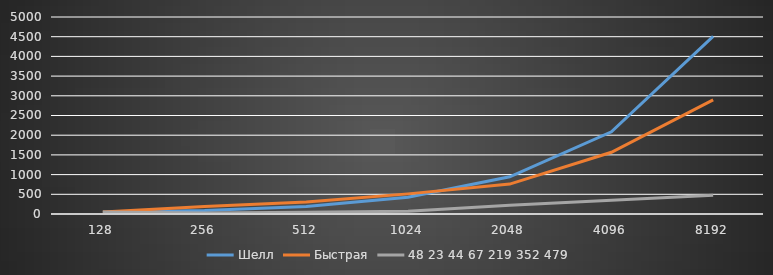
| Category | Шелл | Быстрая | 48 |
|---|---|---|---|
| 128.0 | 41.667 | 48.333 | 48.333 |
| 256.0 | 86.667 | 192.333 | 23.333 |
| 512.0 | 192.667 | 304.667 | 43.667 |
| 1024.0 | 423.667 | 510.667 | 67 |
| 2048.0 | 943.333 | 759.667 | 219.333 |
| 4096.0 | 2086.667 | 1567.333 | 351.667 |
| 8192.0 | 4507 | 2897.333 | 479 |